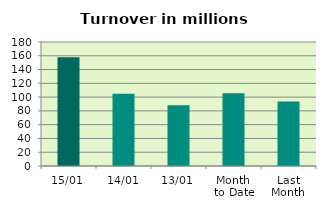
| Category | Series 0 |
|---|---|
| 15/01 | 157.786 |
| 14/01 | 104.889 |
| 13/01 | 88.201 |
| Month 
to Date | 105.716 |
| Last
Month | 93.592 |